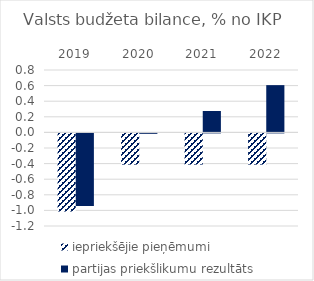
| Category | iepriekšējie pieņēmumi | partijas priekšlikumu rezultāts |
|---|---|---|
| 2019.0 | -1 | -0.93 |
| 2020.0 | -0.4 | -0.005 |
| 2021.0 | -0.4 | 0.274 |
| 2022.0 | -0.4 | 0.606 |